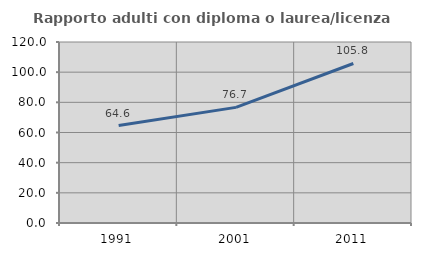
| Category | Rapporto adulti con diploma o laurea/licenza media  |
|---|---|
| 1991.0 | 64.607 |
| 2001.0 | 76.652 |
| 2011.0 | 105.752 |